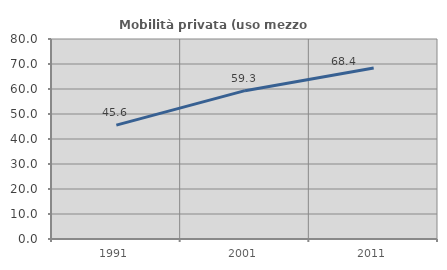
| Category | Mobilità privata (uso mezzo privato) |
|---|---|
| 1991.0 | 45.56 |
| 2001.0 | 59.332 |
| 2011.0 | 68.367 |